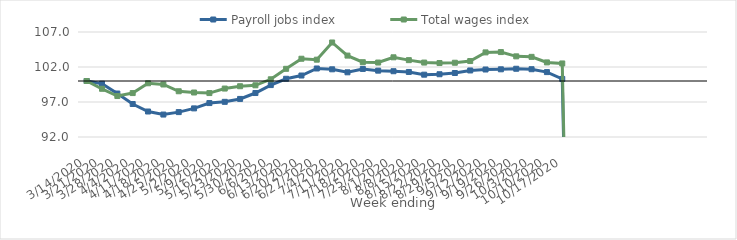
| Category | Payroll jobs index | Total wages index |
|---|---|---|
| 14/03/2020 | 100 | 100 |
| 21/03/2020 | 99.611 | 98.888 |
| 28/03/2020 | 98.212 | 97.851 |
| 04/04/2020 | 96.713 | 98.276 |
| 11/04/2020 | 95.641 | 99.676 |
| 18/04/2020 | 95.207 | 99.5 |
| 25/04/2020 | 95.556 | 98.534 |
| 02/05/2020 | 96.089 | 98.356 |
| 09/05/2020 | 96.847 | 98.276 |
| 16/05/2020 | 97.023 | 98.92 |
| 23/05/2020 | 97.438 | 99.253 |
| 30/05/2020 | 98.283 | 99.387 |
| 06/06/2020 | 99.417 | 100.245 |
| 13/06/2020 | 100.318 | 101.739 |
| 20/06/2020 | 100.782 | 103.179 |
| 27/06/2020 | 101.786 | 103.045 |
| 04/07/2020 | 101.67 | 105.504 |
| 11/07/2020 | 101.241 | 103.628 |
| 18/07/2020 | 101.725 | 102.684 |
| 25/07/2020 | 101.48 | 102.638 |
| 01/08/2020 | 101.397 | 103.386 |
| 08/08/2020 | 101.292 | 102.979 |
| 15/08/2020 | 100.902 | 102.633 |
| 22/08/2020 | 100.966 | 102.566 |
| 29/08/2020 | 101.142 | 102.608 |
| 05/09/2020 | 101.505 | 102.85 |
| 12/09/2020 | 101.641 | 104.086 |
| 19/09/2020 | 101.671 | 104.133 |
| 26/09/2020 | 101.748 | 103.521 |
| 03/10/2020 | 101.683 | 103.45 |
| 10/10/2020 | 101.272 | 102.656 |
| 17/10/2020 | 100.295 | 102.506 |